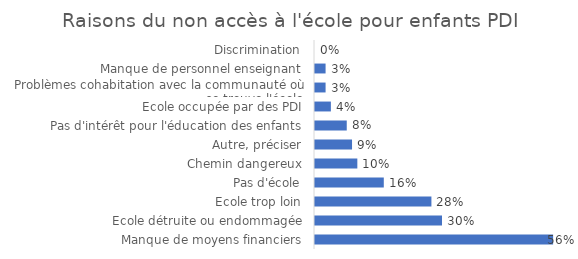
| Category | Fréquence |
|---|---|
| Manque de moyens financiers | 0.562 |
| Ecole détruite ou endommagée | 0.3 |
| Ecole trop loin | 0.275 |
| Pas d'école | 0.162 |
| Chemin dangereux | 0.1 |
|  Autre, préciser | 0.088 |
| Pas d'intérêt pour l'éducation des enfants | 0.075 |
| Ecole occupée par des PDI | 0.038 |
| Problèmes cohabitation avec la communauté où se trouve l'école | 0.025 |
| Manque de personnel enseignant | 0.025 |
| Discrimination | 0 |